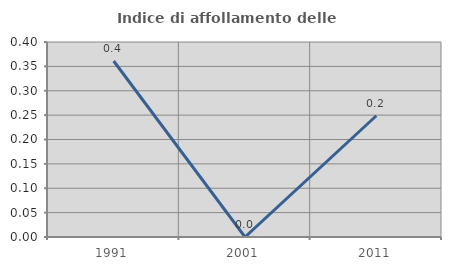
| Category | Indice di affollamento delle abitazioni  |
|---|---|
| 1991.0 | 0.361 |
| 2001.0 | 0 |
| 2011.0 | 0.249 |